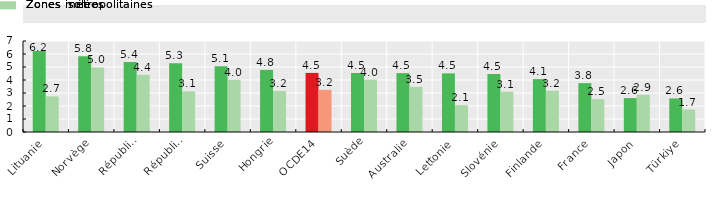
| Category | Zones métropolitaines | Zones isolées |
|---|---|---|
| Lituanie | 6.23 | 2.74 |
| Norvège | 5.83 | 4.97 |
| République tchèque | 5.39 | 4.4 |
| République slovaque | 5.29 | 3.12 |
| Suisse | 5.06 | 4.02 |
| Hongrie | 4.78 | 3.15 |
| OCDE14 | 4.546 | 3.24 |
| Suède | 4.54 | 4.03 |
| Australie | 4.53 | 3.47 |
| Lettonie | 4.51 | 2.06 |
| Slovénie | 4.46 | 3.1 |
| Finlande | 4.07 | 3.17 |
| France | 3.76 | 2.53 |
| Japon | 2.61 | 2.87 |
| Türkiye | 2.58 | 1.73 |